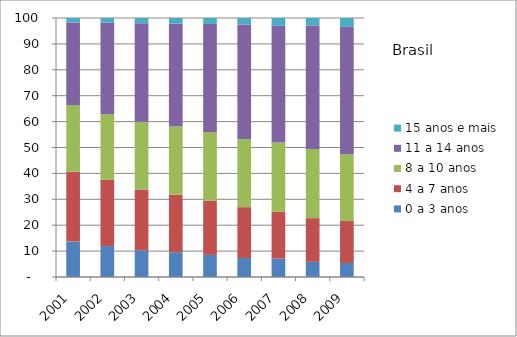
| Category | 0 a 3 anos | 4 a 7 anos | 8 a 10 anos | 11 a 14 anos | 15 anos e mais |
|---|---|---|---|---|---|
| 2001.0 | 13.66 | 26.95 | 25.79 | 31.86 | 1.74 |
| 2002.0 | 11.94 | 25.68 | 25.22 | 35.33 | 1.83 |
| 2003.0 | 10.32 | 23.38 | 26.26 | 37.99 | 2.05 |
| 2004.0 | 9.57 | 22.17 | 26.41 | 39.66 | 2.19 |
| 2005.0 | 8.55 | 20.96 | 26.43 | 41.76 | 2.31 |
| 2006.0 | 7.34 | 19.63 | 26.36 | 44.17 | 2.5 |
| 2007.0 | 7.15 | 18.05 | 26.69 | 45.1 | 3 |
| 2008.0 | 5.85 | 16.88 | 26.72 | 47.66 | 2.88 |
| 2009.0 | 5.42 | 16.19 | 25.75 | 49.2 | 3.43 |